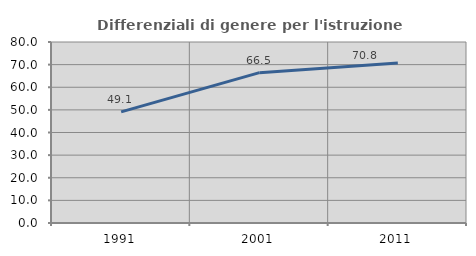
| Category | Differenziali di genere per l'istruzione superiore |
|---|---|
| 1991.0 | 49.123 |
| 2001.0 | 66.451 |
| 2011.0 | 70.755 |